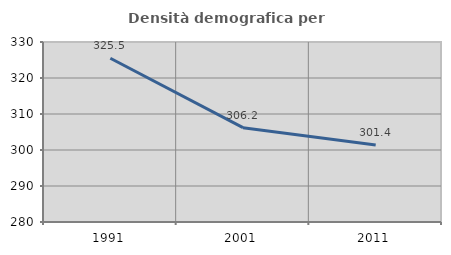
| Category | Densità demografica |
|---|---|
| 1991.0 | 325.491 |
| 2001.0 | 306.199 |
| 2011.0 | 301.413 |